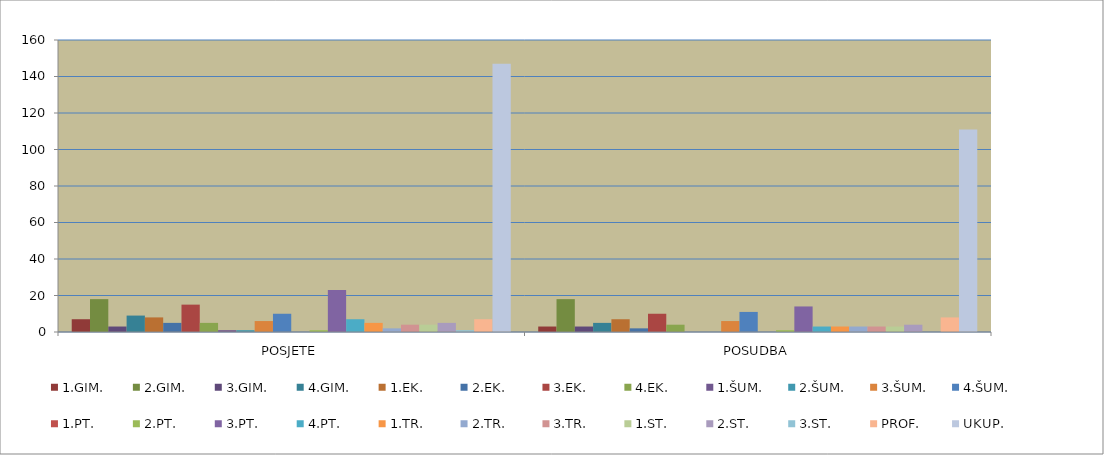
| Category | Stupac2 | 1.GIM. | 2.GIM. | 3.GIM. | 4.GIM. | 1.EK. | 2.EK. | 3.EK. | 4.EK. | 1.ŠUM. | 2.ŠUM. | 3.ŠUM. | 4.ŠUM. | 1.PT. | 2.PT. | 3.PT. | 4.PT. | 1.TR. | 2.TR. | 3.TR. | 1.ST. | 2.ST. | 3.ST. | PROF. | UKUP. |
|---|---|---|---|---|---|---|---|---|---|---|---|---|---|---|---|---|---|---|---|---|---|---|---|---|---|
| POSJETE |  | 7 | 18 | 3 | 9 | 8 | 5 | 15 | 5 | 1 | 1 | 6 | 10 | 0 | 1 | 23 | 7 | 5 | 2 | 4 | 4 | 5 | 1 | 7 | 147 |
| POSUDBA |  | 3 | 18 | 3 | 5 | 7 | 2 | 10 | 4 | 0 | 0 | 6 | 11 | 0 | 1 | 14 | 3 | 3 | 3 | 3 | 3 | 4 | 0 | 8 | 111 |